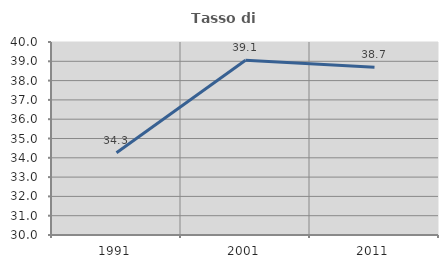
| Category | Tasso di occupazione   |
|---|---|
| 1991.0 | 34.259 |
| 2001.0 | 39.057 |
| 2011.0 | 38.694 |